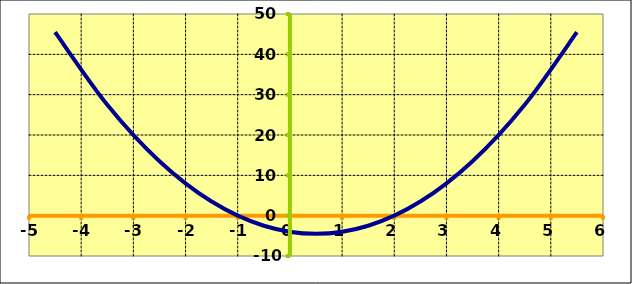
| Category | Series 0 |
|---|---|
| -4.5 | 45.5 |
| -3.5 | 27.5 |
| -2.5 | 13.5 |
| -1.5 | 3.5 |
| -0.5 | -2.5 |
| 0.5 | -4.5 |
| 1.5 | -2.5 |
| 2.5 | 3.5 |
| 3.5 | 13.5 |
| 4.5 | 27.5 |
| 5.5 | 45.5 |